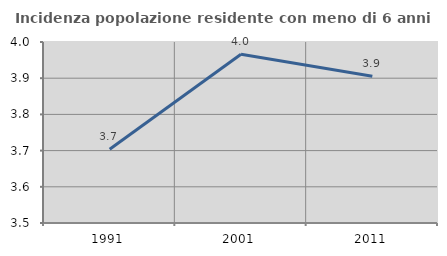
| Category | Incidenza popolazione residente con meno di 6 anni |
|---|---|
| 1991.0 | 3.704 |
| 2001.0 | 3.966 |
| 2011.0 | 3.905 |